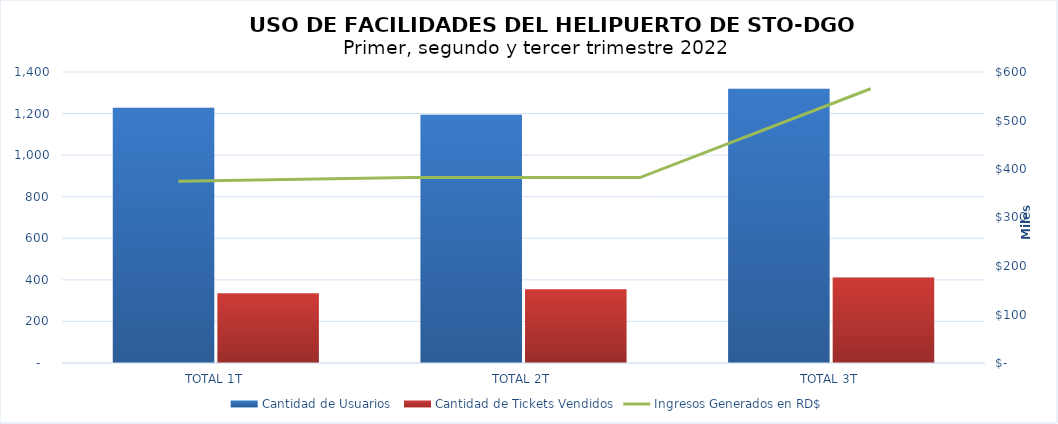
| Category | Cantidad de Usuarios  | Cantidad de Tickets Vendidos |
|---|---|---|
| TOTAL 1T | 1228 | 335 |
| TOTAL 2T | 1194 | 355 |
| TOTAL 3T | 1320 | 411 |